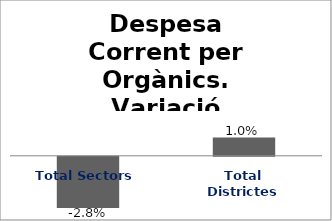
| Category | Series 0 |
|---|---|
| Total Sectors | -0.028 |
| Total Districtes | 0.01 |